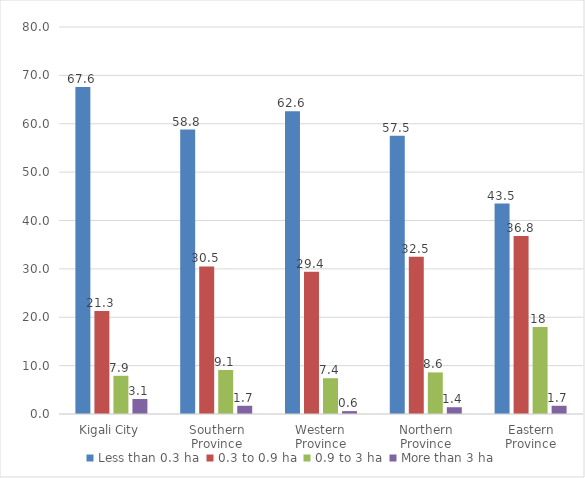
| Category | Less than 0.3 ha | 0.3 to 0.9 ha | 0.9 to 3 ha | More than 3 ha |
|---|---|---|---|---|
| Kigali City | 67.6 | 21.3 | 7.9 | 3.1 |
| Southern Province | 58.8 | 30.5 | 9.1 | 1.7 |
| Western Province | 62.6 | 29.4 | 7.4 | 0.6 |
| Northern Province | 57.5 | 32.5 | 8.6 | 1.4 |
| Eastern Province | 43.5 | 36.8 | 18 | 1.7 |